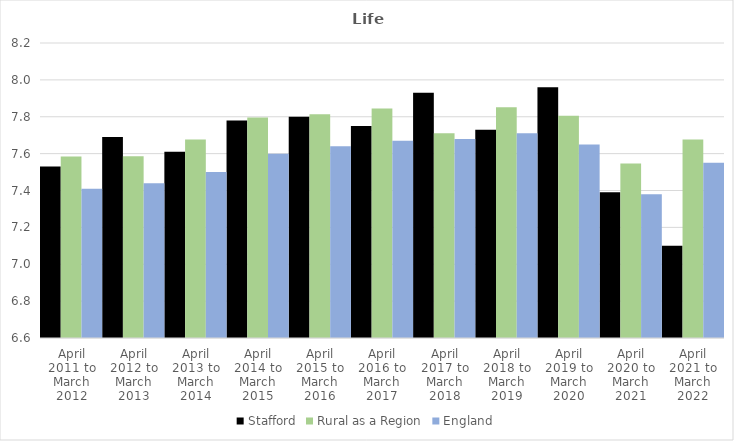
| Category | Stafford | Rural as a Region | England |
|---|---|---|---|
| April 2011 to March 2012 | 7.53 | 7.584 | 7.41 |
| April 2012 to March 2013 | 7.69 | 7.586 | 7.44 |
| April 2013 to March 2014 | 7.61 | 7.677 | 7.5 |
| April 2014 to March 2015 | 7.78 | 7.797 | 7.6 |
| April 2015 to March 2016 | 7.8 | 7.813 | 7.64 |
| April 2016 to March 2017 | 7.75 | 7.845 | 7.67 |
| April 2017 to March 2018 | 7.93 | 7.71 | 7.68 |
| April 2018 to March 2019 | 7.73 | 7.852 | 7.71 |
| April 2019 to March 2020 | 7.96 | 7.806 | 7.65 |
| April 2020 to March 2021 | 7.39 | 7.546 | 7.38 |
| April 2021 to March 2022 | 7.1 | 7.677 | 7.55 |